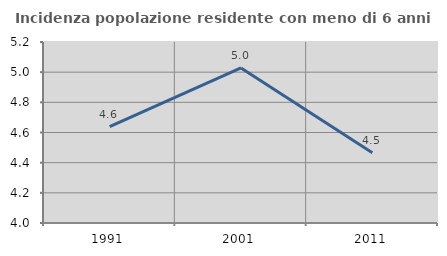
| Category | Incidenza popolazione residente con meno di 6 anni |
|---|---|
| 1991.0 | 4.638 |
| 2001.0 | 5.028 |
| 2011.0 | 4.466 |